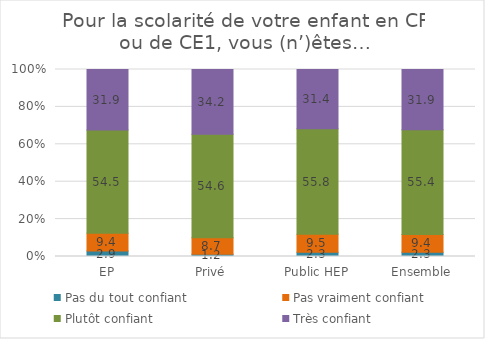
| Category | Pas du tout confiant | Pas vraiment confiant | Plutôt confiant | Très confiant |
|---|---|---|---|---|
| EP | 2.9 | 9.41 | 54.54 | 31.88 |
| Privé | 1.18 | 8.72 | 54.57 | 34.15 |
| Public HEP | 2.3 | 9.46 | 55.8 | 31.42 |
| Ensemble | 2.25 | 9.35 | 55.41 | 31.87 |